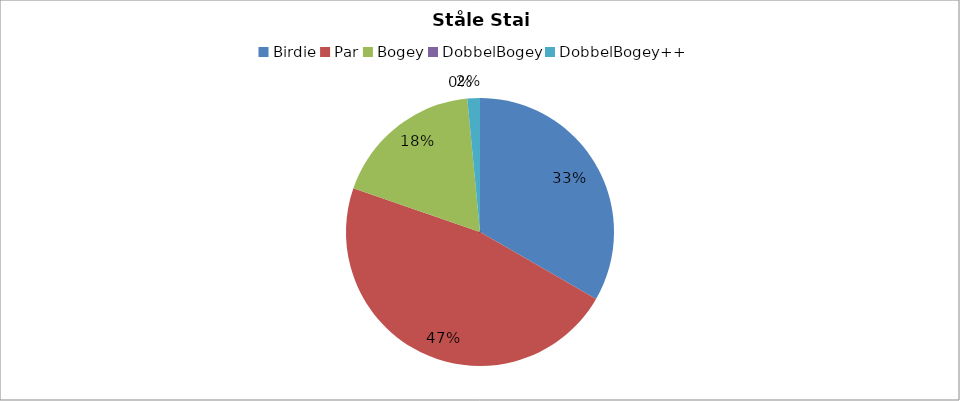
| Category | Ståle Stai Hakstad |
|---|---|
| Birdie | 22 |
| Par | 31 |
| Bogey | 12 |
| DobbelBogey | 0 |
| DobbelBogey++ | 1 |